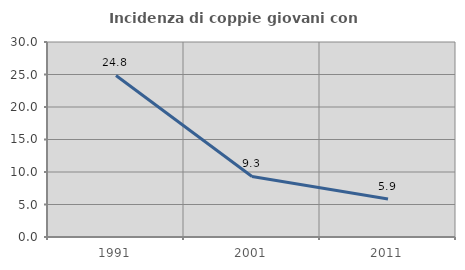
| Category | Incidenza di coppie giovani con figli |
|---|---|
| 1991.0 | 24.849 |
| 2001.0 | 9.311 |
| 2011.0 | 5.853 |